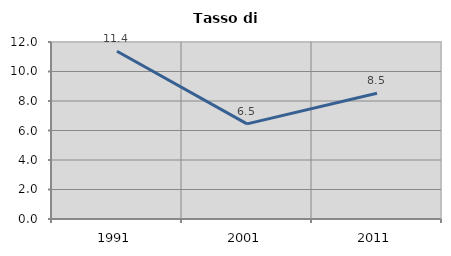
| Category | Tasso di disoccupazione   |
|---|---|
| 1991.0 | 11.372 |
| 2001.0 | 6.451 |
| 2011.0 | 8.521 |